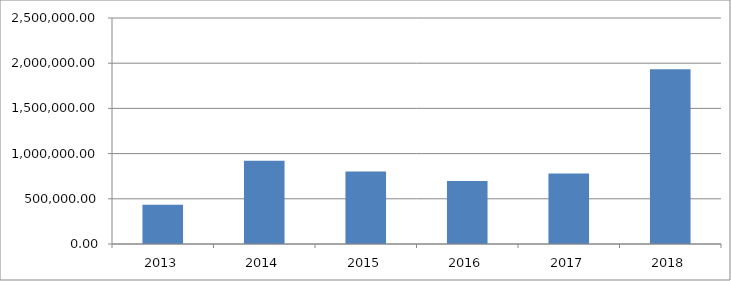
| Category | Series 0 |
|---|---|
| 2013.0 | 433211.104 |
| 2014.0 | 921869.247 |
| 2015.0 | 800670.293 |
| 2016.0 | 695673.661 |
| 2017.0 | 780097.563 |
| 2018.0 | 1932861.01 |